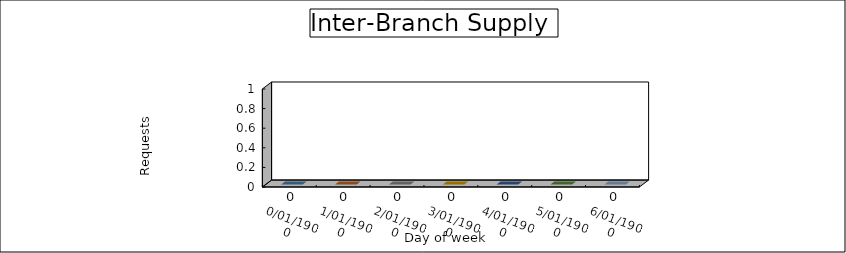
| Category | Inter-branch supply |
|---|---|
| 0.0 | 0 |
| 1900-01-01 | 0 |
| 1900-01-02 | 0 |
| 1900-01-03 | 0 |
| 1900-01-04 | 0 |
| 1900-01-05 | 0 |
| 1900-01-06 | 0 |